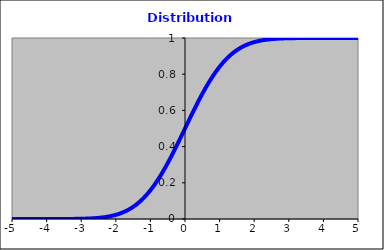
| Category | Series 0 |
|---|---|
| -10.0 | 0 |
| -9.9 | 0 |
| -9.8 | 0 |
| -9.7 | 0 |
| -9.6 | 0 |
| -9.5 | 0 |
| -9.4 | 0 |
| -9.3 | 0 |
| -9.2 | 0 |
| -9.1 | 0 |
| -9.0 | 0 |
| -8.9 | 0 |
| -8.8 | 0 |
| -8.7 | 0 |
| -8.6 | 0 |
| -8.5 | 0 |
| -8.40000000000001 | 0 |
| -8.30000000000001 | 0 |
| -8.20000000000001 | 0 |
| -8.10000000000001 | 0 |
| -8.00000000000001 | 0 |
| -7.90000000000001 | 0 |
| -7.80000000000001 | 0 |
| -7.70000000000001 | 0 |
| -7.60000000000001 | 0 |
| -7.50000000000001 | 0 |
| -7.40000000000001 | 0 |
| -7.30000000000001 | 0 |
| -7.20000000000001 | 0 |
| -7.10000000000001 | 0 |
| -7.00000000000001 | 0 |
| -6.90000000000001 | 0 |
| -6.80000000000001 | 0 |
| -6.70000000000001 | 0 |
| -6.60000000000001 | 0 |
| -6.50000000000001 | 0 |
| -6.40000000000001 | 0 |
| -6.30000000000001 | 0 |
| -6.20000000000001 | 0 |
| -6.10000000000001 | 0 |
| -6.00000000000001 | 0 |
| -5.90000000000001 | 0 |
| -5.80000000000001 | 0 |
| -5.70000000000001 | 0 |
| -5.60000000000002 | 0 |
| -5.50000000000002 | 0 |
| -5.40000000000002 | 0 |
| -5.30000000000002 | 0 |
| -5.20000000000002 | 0 |
| -5.10000000000002 | 0 |
| -5.00000000000002 | 0 |
| -4.90000000000002 | 0 |
| -4.80000000000002 | 0 |
| -4.70000000000002 | 0 |
| -4.60000000000002 | 0 |
| -4.50000000000002 | 0 |
| -4.40000000000002 | 0 |
| -4.30000000000002 | 0 |
| -4.20000000000002 | 0 |
| -4.10000000000002 | 0 |
| -4.00000000000002 | 0 |
| -3.90000000000002 | 0 |
| -3.80000000000002 | 0 |
| -3.70000000000002 | 0 |
| -3.60000000000002 | 0 |
| -3.50000000000002 | 0 |
| -3.40000000000002 | 0 |
| -3.30000000000002 | 0 |
| -3.20000000000002 | 0.001 |
| -3.10000000000002 | 0.001 |
| -3.00000000000002 | 0.001 |
| -2.90000000000002 | 0.002 |
| -2.80000000000003 | 0.003 |
| -2.70000000000003 | 0.003 |
| -2.60000000000003 | 0.005 |
| -2.50000000000003 | 0.006 |
| -2.40000000000003 | 0.008 |
| -2.30000000000003 | 0.011 |
| -2.20000000000003 | 0.014 |
| -2.10000000000003 | 0.018 |
| -2.00000000000003 | 0.023 |
| -1.90000000000003 | 0.029 |
| -1.80000000000003 | 0.036 |
| -1.70000000000003 | 0.045 |
| -1.60000000000003 | 0.055 |
| -1.50000000000003 | 0.067 |
| -1.40000000000003 | 0.081 |
| -1.30000000000003 | 0.097 |
| -1.20000000000003 | 0.115 |
| -1.10000000000003 | 0.136 |
| -1.00000000000003 | 0.159 |
| -0.900000000000031 | 0.184 |
| -0.800000000000031 | 0.212 |
| -0.700000000000029 | 0.242 |
| -0.60000000000003 | 0.274 |
| -0.50000000000003 | 0.309 |
| -0.400000000000031 | 0.345 |
| -0.300000000000031 | 0.382 |
| -0.200000000000029 | 0.421 |
| -0.10000000000003 | 0.46 |
| -4.08562073062058e-14 | 0.5 |
| 0.0999999999999588 | 0.54 |
| 0.199999999999999 | 0.579 |
| 0.299999999999999 | 0.618 |
| 0.4 | 0.655 |
| 0.5 | 0.691 |
| 0.6 | 0.726 |
| 0.699999999999999 | 0.758 |
| 0.799999999999999 | 0.788 |
| 0.9 | 0.816 |
| 1.0 | 0.841 |
| 1.1 | 0.864 |
| 1.2 | 0.885 |
| 1.3 | 0.903 |
| 1.4 | 0.919 |
| 1.5 | 0.933 |
| 1.6 | 0.945 |
| 1.7 | 0.955 |
| 1.8 | 0.964 |
| 1.9 | 0.971 |
| 2.0 | 0.977 |
| 2.1 | 0.982 |
| 2.2 | 0.986 |
| 2.3 | 0.989 |
| 2.4 | 0.992 |
| 2.5 | 0.994 |
| 2.6 | 0.995 |
| 2.7 | 0.997 |
| 2.8 | 0.997 |
| 2.9 | 0.998 |
| 3.0 | 0.999 |
| 3.1 | 0.999 |
| 3.2 | 0.999 |
| 3.3 | 1 |
| 3.4 | 1 |
| 3.5 | 1 |
| 3.6 | 1 |
| 3.7 | 1 |
| 3.8 | 1 |
| 3.9 | 1 |
| 4.0 | 1 |
| 4.1 | 1 |
| 4.1999999999999 | 1 |
| 4.2999999999999 | 1 |
| 4.3999999999999 | 1 |
| 4.4999999999999 | 1 |
| 4.5999999999999 | 1 |
| 4.6999999999999 | 1 |
| 4.7999999999999 | 1 |
| 4.8999999999999 | 1 |
| 4.9999999999999 | 1 |
| 5.0999999999999 | 1 |
| 5.1999999999999 | 1 |
| 5.2999999999999 | 1 |
| 5.3999999999999 | 1 |
| 5.4999999999999 | 1 |
| 5.5999999999999 | 1 |
| 5.6999999999999 | 1 |
| 5.7999999999999 | 1 |
| 5.8999999999999 | 1 |
| 5.9999999999999 | 1 |
| 6.0999999999999 | 1 |
| 6.1999999999999 | 1 |
| 6.2999999999999 | 1 |
| 6.3999999999999 | 1 |
| 6.4999999999999 | 1 |
| 6.5999999999999 | 1 |
| 6.6999999999999 | 1 |
| 6.7999999999999 | 1 |
| 6.8999999999999 | 1 |
| 6.9999999999999 | 1 |
| 7.0999999999999 | 1 |
| 7.1999999999999 | 1 |
| 7.2999999999999 | 1 |
| 7.3999999999999 | 1 |
| 7.4999999999999 | 1 |
| 7.5999999999999 | 1 |
| 7.6999999999999 | 1 |
| 7.7999999999999 | 1 |
| 7.8999999999999 | 1 |
| 7.9999999999999 | 1 |
| 8.0999999999999 | 1 |
| 8.1999999999999 | 1 |
| 8.2999999999999 | 1 |
| 8.3999999999999 | 1 |
| 8.4999999999999 | 1 |
| 8.5999999999999 | 1 |
| 8.6999999999999 | 1 |
| 8.7999999999999 | 1 |
| 8.8999999999999 | 1 |
| 8.9999999999999 | 1 |
| 9.0999999999999 | 1 |
| 9.1999999999999 | 1 |
| 9.2999999999999 | 1 |
| 9.3999999999999 | 1 |
| 9.4999999999999 | 1 |
| 9.5999999999999 | 1 |
| 9.6999999999999 | 1 |
| 9.7999999999999 | 1 |
| 9.8999999999999 | 1 |
| 9.9999999999999 | 1 |